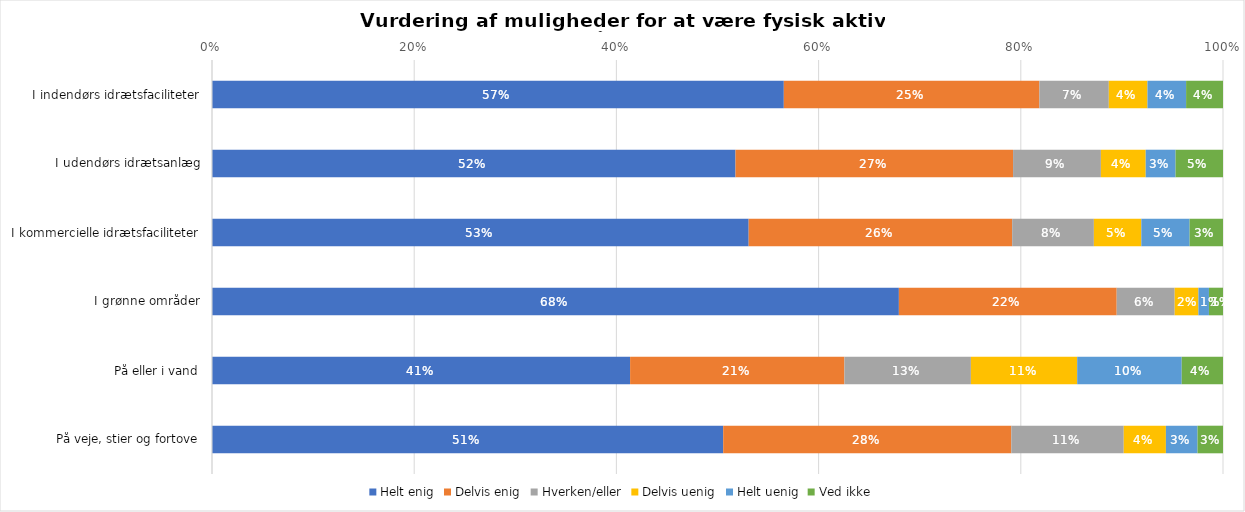
| Category | Helt enig | Delvis enig | Hverken/eller | Delvis uenig | Helt uenig | Ved ikke |
|---|---|---|---|---|---|---|
| I indendørs idrætsfaciliteter | 0.566 | 0.253 | 0.069 | 0.038 | 0.038 | 0.036 |
| I udendørs idrætsanlæg | 0.518 | 0.275 | 0.087 | 0.044 | 0.03 | 0.047 |
| I kommercielle idrætsfaciliteter | 0.531 | 0.261 | 0.081 | 0.047 | 0.048 | 0.033 |
| I grønne områder | 0.679 | 0.215 | 0.057 | 0.023 | 0.01 | 0.014 |
| På eller i vand | 0.414 | 0.212 | 0.125 | 0.105 | 0.103 | 0.041 |
| På veje, stier og fortove | 0.506 | 0.285 | 0.111 | 0.042 | 0.031 | 0.025 |